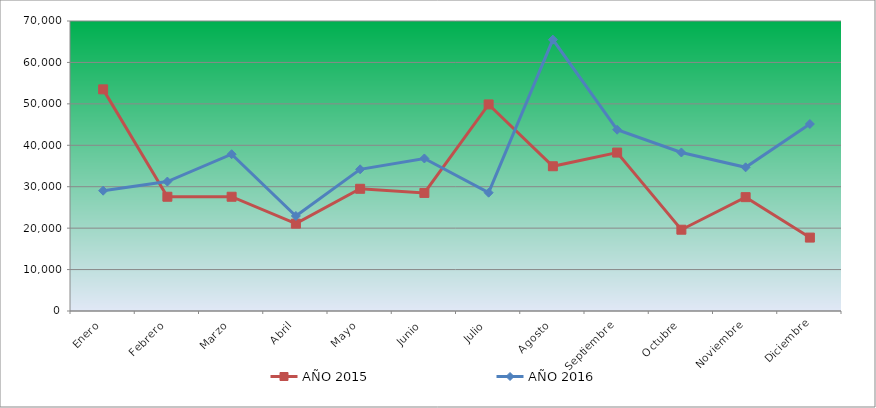
| Category | AÑO 2015 | AÑO 2016 |
|---|---|---|
| Enero | 53500 | 29040 |
| Febrero | 27580 | 31240 |
| Marzo | 27580 | 37840 |
| Abril | 21080 | 22940 |
| Mayo | 29500 | 34200 |
| Junio | 28500 | 36820 |
| Julio | 49860 | 28560 |
| Agosto | 34940 | 65500 |
| Septiembre | 38240 | 43760 |
| Octubre | 19620 | 38260 |
| Noviembre | 27480 | 34680 |
| Diciembre | 17720 | 45140 |